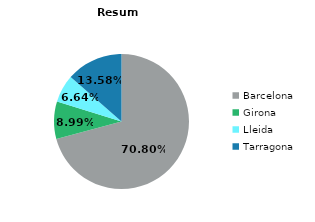
| Category | Mes actual |
|---|---|
| Barcelona | 4182 |
| Girona | 531 |
| Lleida | 392 |
| Tarragona | 802 |